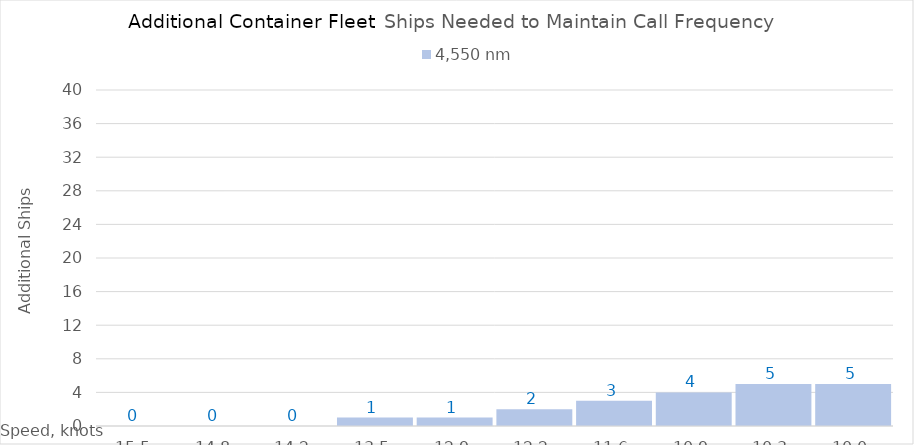
| Category | 4,550 |
|---|---|
| 15.450000000000001 | 0 |
| 14.8 | 0 |
| 14.15 | 0 |
| 13.5 | 1 |
| 12.85 | 1 |
| 12.2 | 2 |
| 11.549999999999999 | 3 |
| 10.899999999999999 | 4 |
| 10.249999999999998 | 5 |
| 10.0 | 5 |